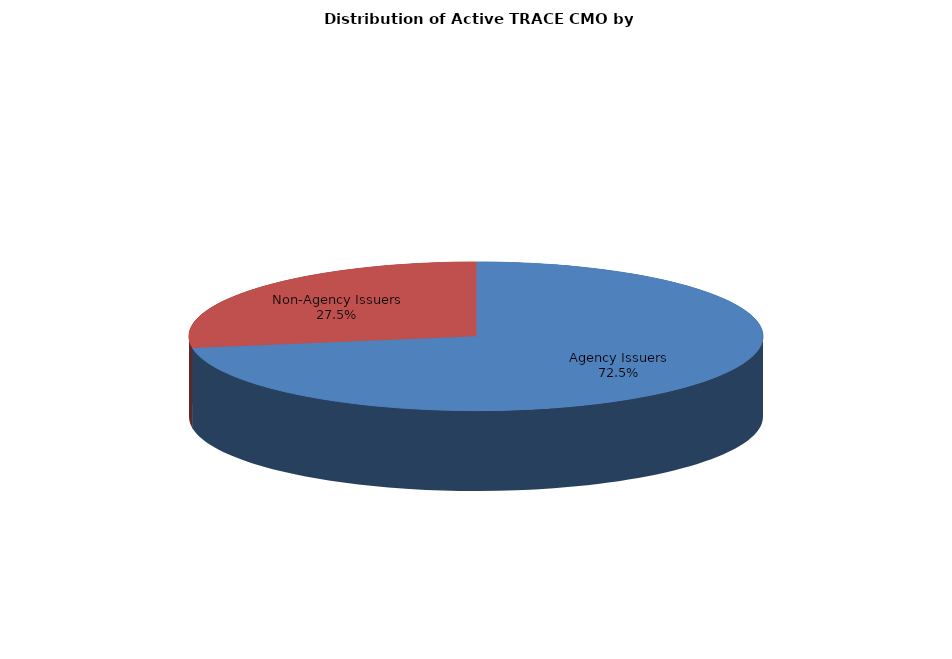
| Category | Series 0 |
|---|---|
| Agency Issuers | 269630 |
| Non-Agency Issuers | 102438 |